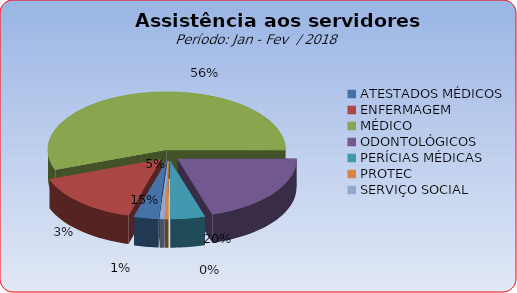
| Category | Series 0 |
|---|---|
| ATESTADOS MÉDICOS | 3.302 |
| ENFERMAGEM | 14.937 |
| MÉDICO | 55.66 |
| ODONTOLÓGICOS | 20.283 |
| PERÍCIAS MÉDICAS | 4.717 |
| PROTEC | 0.472 |
| SERVIÇO SOCIAL | 0.629 |